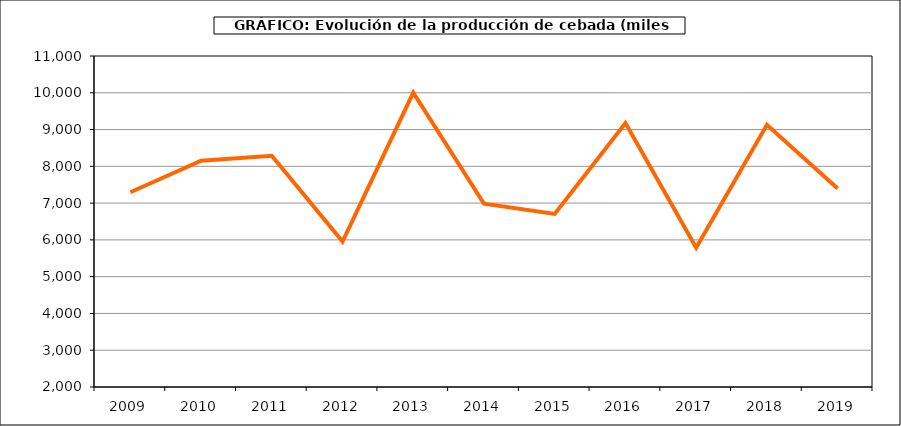
| Category | Producción |
|---|---|
| 2009.0 | 7295.934 |
| 2010.0 | 8154.392 |
| 2011.0 | 8287.073 |
| 2012.0 | 5956.347 |
| 2013.0 | 10004.998 |
| 2014.0 | 6983.289 |
| 2015.0 | 6705.106 |
| 2016.0 | 9176.159 |
| 2017.0 | 5785.944 |
| 2018.0 | 9129.535 |
| 2019.0 | 7399.966 |